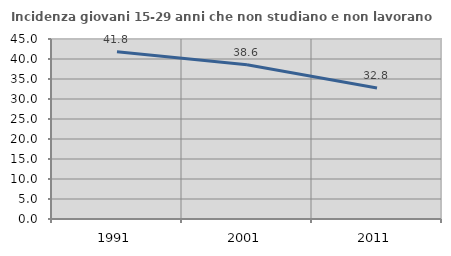
| Category | Incidenza giovani 15-29 anni che non studiano e non lavorano  |
|---|---|
| 1991.0 | 41.837 |
| 2001.0 | 38.571 |
| 2011.0 | 32.759 |